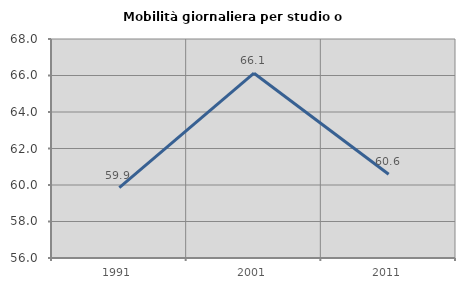
| Category | Mobilità giornaliera per studio o lavoro |
|---|---|
| 1991.0 | 59.857 |
| 2001.0 | 66.126 |
| 2011.0 | 60.59 |